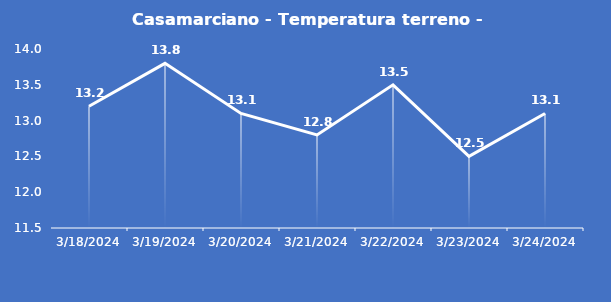
| Category | Casamarciano - Temperatura terreno - Grezzo (°C) |
|---|---|
| 3/18/24 | 13.2 |
| 3/19/24 | 13.8 |
| 3/20/24 | 13.1 |
| 3/21/24 | 12.8 |
| 3/22/24 | 13.5 |
| 3/23/24 | 12.5 |
| 3/24/24 | 13.1 |